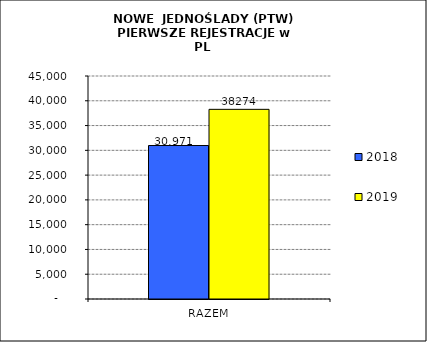
| Category | 2018 | 2019 |
|---|---|---|
| RAZEM | 30971 | 38274 |